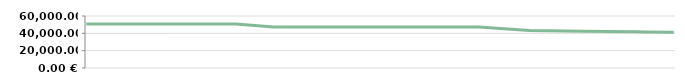
| Category | KVARTAL   |
|---|---|
| 2013-04-23 | 50800 |
| 2013-04-25 | 50800 |
| 2013-05-07 | 50800 |
| 2013-05-14 | 50800 |
| 2013-05-14 | 50800 |
| 2013-05-29 | 50800 |
| 2013-06-10 | 50800 |
| 2013-06-21 | 50800 |
| 2013-07-06 | 47400 |
| 2013-08-05 | 47400 |
| 2013-08-19 | 47400 |
| 2013-09-04 | 47400 |
| 2013-09-20 | 47400 |
| 2013-09-25 | 47400 |
| 2013-10-15 | 43258.14 |
| 2013-11-05 | 42312.903 |
| 2013-11-26 | 41811.111 |
| 2013-11-30 | 41500 |
| 2013-12-11 | 41288.235 |